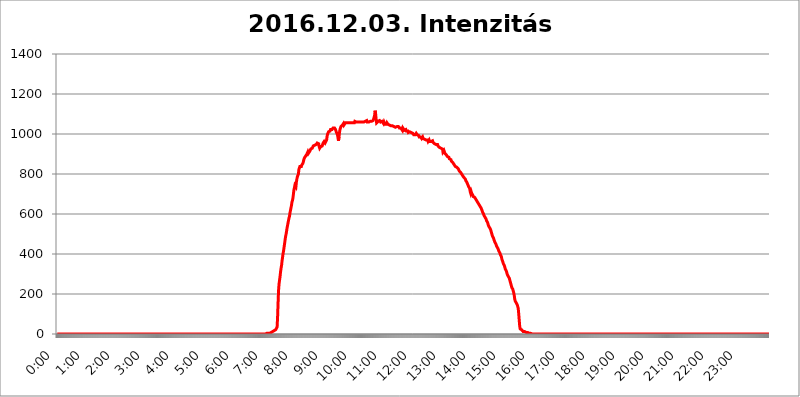
| Category | 2016.12.03. Intenzitás [W/m^2] |
|---|---|
| 0.0 | 0 |
| 0.0006944444444444445 | 0 |
| 0.001388888888888889 | 0 |
| 0.0020833333333333333 | 0 |
| 0.002777777777777778 | 0 |
| 0.003472222222222222 | 0 |
| 0.004166666666666667 | 0 |
| 0.004861111111111111 | 0 |
| 0.005555555555555556 | 0 |
| 0.0062499999999999995 | 0 |
| 0.006944444444444444 | 0 |
| 0.007638888888888889 | 0 |
| 0.008333333333333333 | 0 |
| 0.009027777777777779 | 0 |
| 0.009722222222222222 | 0 |
| 0.010416666666666666 | 0 |
| 0.011111111111111112 | 0 |
| 0.011805555555555555 | 0 |
| 0.012499999999999999 | 0 |
| 0.013194444444444444 | 0 |
| 0.013888888888888888 | 0 |
| 0.014583333333333332 | 0 |
| 0.015277777777777777 | 0 |
| 0.015972222222222224 | 0 |
| 0.016666666666666666 | 0 |
| 0.017361111111111112 | 0 |
| 0.018055555555555557 | 0 |
| 0.01875 | 0 |
| 0.019444444444444445 | 0 |
| 0.02013888888888889 | 0 |
| 0.020833333333333332 | 0 |
| 0.02152777777777778 | 0 |
| 0.022222222222222223 | 0 |
| 0.02291666666666667 | 0 |
| 0.02361111111111111 | 0 |
| 0.024305555555555556 | 0 |
| 0.024999999999999998 | 0 |
| 0.025694444444444447 | 0 |
| 0.02638888888888889 | 0 |
| 0.027083333333333334 | 0 |
| 0.027777777777777776 | 0 |
| 0.02847222222222222 | 0 |
| 0.029166666666666664 | 0 |
| 0.029861111111111113 | 0 |
| 0.030555555555555555 | 0 |
| 0.03125 | 0 |
| 0.03194444444444445 | 0 |
| 0.03263888888888889 | 0 |
| 0.03333333333333333 | 0 |
| 0.034027777777777775 | 0 |
| 0.034722222222222224 | 0 |
| 0.035416666666666666 | 0 |
| 0.036111111111111115 | 0 |
| 0.03680555555555556 | 0 |
| 0.0375 | 0 |
| 0.03819444444444444 | 0 |
| 0.03888888888888889 | 0 |
| 0.03958333333333333 | 0 |
| 0.04027777777777778 | 0 |
| 0.04097222222222222 | 0 |
| 0.041666666666666664 | 0 |
| 0.042361111111111106 | 0 |
| 0.04305555555555556 | 0 |
| 0.043750000000000004 | 0 |
| 0.044444444444444446 | 0 |
| 0.04513888888888889 | 0 |
| 0.04583333333333334 | 0 |
| 0.04652777777777778 | 0 |
| 0.04722222222222222 | 0 |
| 0.04791666666666666 | 0 |
| 0.04861111111111111 | 0 |
| 0.049305555555555554 | 0 |
| 0.049999999999999996 | 0 |
| 0.05069444444444445 | 0 |
| 0.051388888888888894 | 0 |
| 0.052083333333333336 | 0 |
| 0.05277777777777778 | 0 |
| 0.05347222222222222 | 0 |
| 0.05416666666666667 | 0 |
| 0.05486111111111111 | 0 |
| 0.05555555555555555 | 0 |
| 0.05625 | 0 |
| 0.05694444444444444 | 0 |
| 0.057638888888888885 | 0 |
| 0.05833333333333333 | 0 |
| 0.05902777777777778 | 0 |
| 0.059722222222222225 | 0 |
| 0.06041666666666667 | 0 |
| 0.061111111111111116 | 0 |
| 0.06180555555555556 | 0 |
| 0.0625 | 0 |
| 0.06319444444444444 | 0 |
| 0.06388888888888888 | 0 |
| 0.06458333333333334 | 0 |
| 0.06527777777777778 | 0 |
| 0.06597222222222222 | 0 |
| 0.06666666666666667 | 0 |
| 0.06736111111111111 | 0 |
| 0.06805555555555555 | 0 |
| 0.06874999999999999 | 0 |
| 0.06944444444444443 | 0 |
| 0.07013888888888889 | 0 |
| 0.07083333333333333 | 0 |
| 0.07152777777777779 | 0 |
| 0.07222222222222223 | 0 |
| 0.07291666666666667 | 0 |
| 0.07361111111111111 | 0 |
| 0.07430555555555556 | 0 |
| 0.075 | 0 |
| 0.07569444444444444 | 0 |
| 0.0763888888888889 | 0 |
| 0.07708333333333334 | 0 |
| 0.07777777777777778 | 0 |
| 0.07847222222222222 | 0 |
| 0.07916666666666666 | 0 |
| 0.0798611111111111 | 0 |
| 0.08055555555555556 | 0 |
| 0.08125 | 0 |
| 0.08194444444444444 | 0 |
| 0.08263888888888889 | 0 |
| 0.08333333333333333 | 0 |
| 0.08402777777777777 | 0 |
| 0.08472222222222221 | 0 |
| 0.08541666666666665 | 0 |
| 0.08611111111111112 | 0 |
| 0.08680555555555557 | 0 |
| 0.08750000000000001 | 0 |
| 0.08819444444444445 | 0 |
| 0.08888888888888889 | 0 |
| 0.08958333333333333 | 0 |
| 0.09027777777777778 | 0 |
| 0.09097222222222222 | 0 |
| 0.09166666666666667 | 0 |
| 0.09236111111111112 | 0 |
| 0.09305555555555556 | 0 |
| 0.09375 | 0 |
| 0.09444444444444444 | 0 |
| 0.09513888888888888 | 0 |
| 0.09583333333333333 | 0 |
| 0.09652777777777777 | 0 |
| 0.09722222222222222 | 0 |
| 0.09791666666666667 | 0 |
| 0.09861111111111111 | 0 |
| 0.09930555555555555 | 0 |
| 0.09999999999999999 | 0 |
| 0.10069444444444443 | 0 |
| 0.1013888888888889 | 0 |
| 0.10208333333333335 | 0 |
| 0.10277777777777779 | 0 |
| 0.10347222222222223 | 0 |
| 0.10416666666666667 | 0 |
| 0.10486111111111111 | 0 |
| 0.10555555555555556 | 0 |
| 0.10625 | 0 |
| 0.10694444444444444 | 0 |
| 0.1076388888888889 | 0 |
| 0.10833333333333334 | 0 |
| 0.10902777777777778 | 0 |
| 0.10972222222222222 | 0 |
| 0.1111111111111111 | 0 |
| 0.11180555555555556 | 0 |
| 0.11180555555555556 | 0 |
| 0.1125 | 0 |
| 0.11319444444444444 | 0 |
| 0.11388888888888889 | 0 |
| 0.11458333333333333 | 0 |
| 0.11527777777777777 | 0 |
| 0.11597222222222221 | 0 |
| 0.11666666666666665 | 0 |
| 0.1173611111111111 | 0 |
| 0.11805555555555557 | 0 |
| 0.11944444444444445 | 0 |
| 0.12013888888888889 | 0 |
| 0.12083333333333333 | 0 |
| 0.12152777777777778 | 0 |
| 0.12222222222222223 | 0 |
| 0.12291666666666667 | 0 |
| 0.12291666666666667 | 0 |
| 0.12361111111111112 | 0 |
| 0.12430555555555556 | 0 |
| 0.125 | 0 |
| 0.12569444444444444 | 0 |
| 0.12638888888888888 | 0 |
| 0.12708333333333333 | 0 |
| 0.16875 | 0 |
| 0.12847222222222224 | 0 |
| 0.12916666666666668 | 0 |
| 0.12986111111111112 | 0 |
| 0.13055555555555556 | 0 |
| 0.13125 | 0 |
| 0.13194444444444445 | 0 |
| 0.1326388888888889 | 0 |
| 0.13333333333333333 | 0 |
| 0.13402777777777777 | 0 |
| 0.13402777777777777 | 0 |
| 0.13472222222222222 | 0 |
| 0.13541666666666666 | 0 |
| 0.1361111111111111 | 0 |
| 0.13749999999999998 | 0 |
| 0.13819444444444443 | 0 |
| 0.1388888888888889 | 0 |
| 0.13958333333333334 | 0 |
| 0.14027777777777778 | 0 |
| 0.14097222222222222 | 0 |
| 0.14166666666666666 | 0 |
| 0.1423611111111111 | 0 |
| 0.14305555555555557 | 0 |
| 0.14375000000000002 | 0 |
| 0.14444444444444446 | 0 |
| 0.1451388888888889 | 0 |
| 0.1451388888888889 | 0 |
| 0.14652777777777778 | 0 |
| 0.14722222222222223 | 0 |
| 0.14791666666666667 | 0 |
| 0.1486111111111111 | 0 |
| 0.14930555555555555 | 0 |
| 0.15 | 0 |
| 0.15069444444444444 | 0 |
| 0.15138888888888888 | 0 |
| 0.15208333333333332 | 0 |
| 0.15277777777777776 | 0 |
| 0.15347222222222223 | 0 |
| 0.15416666666666667 | 0 |
| 0.15486111111111112 | 0 |
| 0.15555555555555556 | 0 |
| 0.15625 | 0 |
| 0.15694444444444444 | 0 |
| 0.15763888888888888 | 0 |
| 0.15833333333333333 | 0 |
| 0.15902777777777777 | 0 |
| 0.15972222222222224 | 0 |
| 0.16041666666666668 | 0 |
| 0.16111111111111112 | 0 |
| 0.16180555555555556 | 0 |
| 0.1625 | 0 |
| 0.16319444444444445 | 0 |
| 0.1638888888888889 | 0 |
| 0.16458333333333333 | 0 |
| 0.16527777777777777 | 0 |
| 0.16597222222222222 | 0 |
| 0.16666666666666666 | 0 |
| 0.1673611111111111 | 0 |
| 0.16805555555555554 | 0 |
| 0.16874999999999998 | 0 |
| 0.16944444444444443 | 0 |
| 0.17013888888888887 | 0 |
| 0.1708333333333333 | 0 |
| 0.17152777777777775 | 0 |
| 0.17222222222222225 | 0 |
| 0.1729166666666667 | 0 |
| 0.17361111111111113 | 0 |
| 0.17430555555555557 | 0 |
| 0.17500000000000002 | 0 |
| 0.17569444444444446 | 0 |
| 0.1763888888888889 | 0 |
| 0.17708333333333334 | 0 |
| 0.17777777777777778 | 0 |
| 0.17847222222222223 | 0 |
| 0.17916666666666667 | 0 |
| 0.1798611111111111 | 0 |
| 0.18055555555555555 | 0 |
| 0.18125 | 0 |
| 0.18194444444444444 | 0 |
| 0.1826388888888889 | 0 |
| 0.18333333333333335 | 0 |
| 0.1840277777777778 | 0 |
| 0.18472222222222223 | 0 |
| 0.18541666666666667 | 0 |
| 0.18611111111111112 | 0 |
| 0.18680555555555556 | 0 |
| 0.1875 | 0 |
| 0.18819444444444444 | 0 |
| 0.18888888888888888 | 0 |
| 0.18958333333333333 | 0 |
| 0.19027777777777777 | 0 |
| 0.1909722222222222 | 0 |
| 0.19166666666666665 | 0 |
| 0.19236111111111112 | 0 |
| 0.19305555555555554 | 0 |
| 0.19375 | 0 |
| 0.19444444444444445 | 0 |
| 0.1951388888888889 | 0 |
| 0.19583333333333333 | 0 |
| 0.19652777777777777 | 0 |
| 0.19722222222222222 | 0 |
| 0.19791666666666666 | 0 |
| 0.1986111111111111 | 0 |
| 0.19930555555555554 | 0 |
| 0.19999999999999998 | 0 |
| 0.20069444444444443 | 0 |
| 0.20138888888888887 | 0 |
| 0.2020833333333333 | 0 |
| 0.2027777777777778 | 0 |
| 0.2034722222222222 | 0 |
| 0.2041666666666667 | 0 |
| 0.20486111111111113 | 0 |
| 0.20555555555555557 | 0 |
| 0.20625000000000002 | 0 |
| 0.20694444444444446 | 0 |
| 0.2076388888888889 | 0 |
| 0.20833333333333334 | 0 |
| 0.20902777777777778 | 0 |
| 0.20972222222222223 | 0 |
| 0.21041666666666667 | 0 |
| 0.2111111111111111 | 0 |
| 0.21180555555555555 | 0 |
| 0.2125 | 0 |
| 0.21319444444444444 | 0 |
| 0.2138888888888889 | 0 |
| 0.21458333333333335 | 0 |
| 0.2152777777777778 | 0 |
| 0.21597222222222223 | 0 |
| 0.21666666666666667 | 0 |
| 0.21736111111111112 | 0 |
| 0.21805555555555556 | 0 |
| 0.21875 | 0 |
| 0.21944444444444444 | 0 |
| 0.22013888888888888 | 0 |
| 0.22083333333333333 | 0 |
| 0.22152777777777777 | 0 |
| 0.2222222222222222 | 0 |
| 0.22291666666666665 | 0 |
| 0.2236111111111111 | 0 |
| 0.22430555555555556 | 0 |
| 0.225 | 0 |
| 0.22569444444444445 | 0 |
| 0.2263888888888889 | 0 |
| 0.22708333333333333 | 0 |
| 0.22777777777777777 | 0 |
| 0.22847222222222222 | 0 |
| 0.22916666666666666 | 0 |
| 0.2298611111111111 | 0 |
| 0.23055555555555554 | 0 |
| 0.23124999999999998 | 0 |
| 0.23194444444444443 | 0 |
| 0.23263888888888887 | 0 |
| 0.2333333333333333 | 0 |
| 0.2340277777777778 | 0 |
| 0.2347222222222222 | 0 |
| 0.2354166666666667 | 0 |
| 0.23611111111111113 | 0 |
| 0.23680555555555557 | 0 |
| 0.23750000000000002 | 0 |
| 0.23819444444444446 | 0 |
| 0.2388888888888889 | 0 |
| 0.23958333333333334 | 0 |
| 0.24027777777777778 | 0 |
| 0.24097222222222223 | 0 |
| 0.24166666666666667 | 0 |
| 0.2423611111111111 | 0 |
| 0.24305555555555555 | 0 |
| 0.24375 | 0 |
| 0.24444444444444446 | 0 |
| 0.24513888888888888 | 0 |
| 0.24583333333333335 | 0 |
| 0.2465277777777778 | 0 |
| 0.24722222222222223 | 0 |
| 0.24791666666666667 | 0 |
| 0.24861111111111112 | 0 |
| 0.24930555555555556 | 0 |
| 0.25 | 0 |
| 0.25069444444444444 | 0 |
| 0.2513888888888889 | 0 |
| 0.2520833333333333 | 0 |
| 0.25277777777777777 | 0 |
| 0.2534722222222222 | 0 |
| 0.25416666666666665 | 0 |
| 0.2548611111111111 | 0 |
| 0.2555555555555556 | 0 |
| 0.25625000000000003 | 0 |
| 0.2569444444444445 | 0 |
| 0.2576388888888889 | 0 |
| 0.25833333333333336 | 0 |
| 0.2590277777777778 | 0 |
| 0.25972222222222224 | 0 |
| 0.2604166666666667 | 0 |
| 0.2611111111111111 | 0 |
| 0.26180555555555557 | 0 |
| 0.2625 | 0 |
| 0.26319444444444445 | 0 |
| 0.2638888888888889 | 0 |
| 0.26458333333333334 | 0 |
| 0.2652777777777778 | 0 |
| 0.2659722222222222 | 0 |
| 0.26666666666666666 | 0 |
| 0.2673611111111111 | 0 |
| 0.26805555555555555 | 0 |
| 0.26875 | 0 |
| 0.26944444444444443 | 0 |
| 0.2701388888888889 | 0 |
| 0.2708333333333333 | 0 |
| 0.27152777777777776 | 0 |
| 0.2722222222222222 | 0 |
| 0.27291666666666664 | 0 |
| 0.2736111111111111 | 0 |
| 0.2743055555555555 | 0 |
| 0.27499999999999997 | 0 |
| 0.27569444444444446 | 0 |
| 0.27638888888888885 | 0 |
| 0.27708333333333335 | 0 |
| 0.2777777777777778 | 0 |
| 0.27847222222222223 | 0 |
| 0.2791666666666667 | 0 |
| 0.2798611111111111 | 0 |
| 0.28055555555555556 | 0 |
| 0.28125 | 0 |
| 0.28194444444444444 | 0 |
| 0.2826388888888889 | 0 |
| 0.2833333333333333 | 0 |
| 0.28402777777777777 | 0 |
| 0.2847222222222222 | 0 |
| 0.28541666666666665 | 0 |
| 0.28611111111111115 | 0 |
| 0.28680555555555554 | 0 |
| 0.28750000000000003 | 0 |
| 0.2881944444444445 | 0 |
| 0.2888888888888889 | 0 |
| 0.28958333333333336 | 0 |
| 0.2902777777777778 | 0 |
| 0.29097222222222224 | 0 |
| 0.2916666666666667 | 0 |
| 0.2923611111111111 | 0 |
| 0.29305555555555557 | 3.525 |
| 0.29375 | 3.525 |
| 0.29444444444444445 | 3.525 |
| 0.2951388888888889 | 3.525 |
| 0.29583333333333334 | 3.525 |
| 0.2965277777777778 | 3.525 |
| 0.2972222222222222 | 3.525 |
| 0.29791666666666666 | 3.525 |
| 0.2986111111111111 | 7.887 |
| 0.29930555555555555 | 7.887 |
| 0.3 | 7.887 |
| 0.30069444444444443 | 12.257 |
| 0.3013888888888889 | 12.257 |
| 0.3020833333333333 | 12.257 |
| 0.30277777777777776 | 12.257 |
| 0.3034722222222222 | 16.636 |
| 0.30416666666666664 | 16.636 |
| 0.3048611111111111 | 16.636 |
| 0.3055555555555555 | 21.024 |
| 0.30624999999999997 | 21.024 |
| 0.3069444444444444 | 21.024 |
| 0.3076388888888889 | 21.024 |
| 0.30833333333333335 | 34.234 |
| 0.3090277777777778 | 83.205 |
| 0.30972222222222223 | 155.509 |
| 0.3104166666666667 | 219.309 |
| 0.3111111111111111 | 251.251 |
| 0.31180555555555556 | 269.49 |
| 0.3125 | 287.709 |
| 0.31319444444444444 | 310.44 |
| 0.3138888888888889 | 328.584 |
| 0.3145833333333333 | 342.162 |
| 0.31527777777777777 | 364.728 |
| 0.3159722222222222 | 382.715 |
| 0.31666666666666665 | 400.638 |
| 0.31736111111111115 | 414.035 |
| 0.31805555555555554 | 431.833 |
| 0.31875000000000003 | 449.551 |
| 0.3194444444444445 | 467.187 |
| 0.3201388888888889 | 484.735 |
| 0.32083333333333336 | 497.836 |
| 0.3215277777777778 | 510.885 |
| 0.32222222222222224 | 528.2 |
| 0.3229166666666667 | 541.121 |
| 0.3236111111111111 | 553.986 |
| 0.32430555555555557 | 566.793 |
| 0.325 | 579.542 |
| 0.32569444444444445 | 588.009 |
| 0.3263888888888889 | 604.864 |
| 0.32708333333333334 | 617.436 |
| 0.3277777777777778 | 629.948 |
| 0.3284722222222222 | 642.4 |
| 0.32916666666666666 | 658.909 |
| 0.3298611111111111 | 667.123 |
| 0.33055555555555555 | 679.395 |
| 0.33125 | 699.717 |
| 0.33194444444444443 | 719.877 |
| 0.3326388888888889 | 723.889 |
| 0.3333333333333333 | 743.859 |
| 0.3340277777777778 | 739.877 |
| 0.3347222222222222 | 735.89 |
| 0.3354166666666667 | 759.723 |
| 0.3361111111111111 | 775.492 |
| 0.3368055555555556 | 787.258 |
| 0.33749999999999997 | 787.258 |
| 0.33819444444444446 | 798.974 |
| 0.33888888888888885 | 822.26 |
| 0.33958333333333335 | 829.981 |
| 0.34027777777777773 | 837.682 |
| 0.34097222222222223 | 837.682 |
| 0.3416666666666666 | 833.834 |
| 0.3423611111111111 | 837.682 |
| 0.3430555555555555 | 845.365 |
| 0.34375 | 849.199 |
| 0.3444444444444445 | 853.029 |
| 0.3451388888888889 | 860.676 |
| 0.3458333333333334 | 872.114 |
| 0.34652777777777777 | 879.719 |
| 0.34722222222222227 | 879.719 |
| 0.34791666666666665 | 887.309 |
| 0.34861111111111115 | 887.309 |
| 0.34930555555555554 | 891.099 |
| 0.35000000000000003 | 898.668 |
| 0.3506944444444444 | 902.447 |
| 0.3513888888888889 | 909.996 |
| 0.3520833333333333 | 902.447 |
| 0.3527777777777778 | 906.223 |
| 0.3534722222222222 | 906.223 |
| 0.3541666666666667 | 913.766 |
| 0.3548611111111111 | 917.534 |
| 0.35555555555555557 | 925.06 |
| 0.35625 | 925.06 |
| 0.35694444444444445 | 925.06 |
| 0.3576388888888889 | 928.819 |
| 0.35833333333333334 | 932.576 |
| 0.3590277777777778 | 940.082 |
| 0.3597222222222222 | 940.082 |
| 0.36041666666666666 | 936.33 |
| 0.3611111111111111 | 943.832 |
| 0.36180555555555555 | 947.58 |
| 0.3625 | 947.58 |
| 0.36319444444444443 | 947.58 |
| 0.3638888888888889 | 951.327 |
| 0.3645833333333333 | 955.071 |
| 0.3652777777777778 | 958.814 |
| 0.3659722222222222 | 955.071 |
| 0.3666666666666667 | 951.327 |
| 0.3673611111111111 | 936.33 |
| 0.3680555555555556 | 928.819 |
| 0.36874999999999997 | 928.819 |
| 0.36944444444444446 | 936.33 |
| 0.37013888888888885 | 936.33 |
| 0.37083333333333335 | 932.576 |
| 0.37152777777777773 | 940.082 |
| 0.37222222222222223 | 947.58 |
| 0.3729166666666666 | 955.071 |
| 0.3736111111111111 | 955.071 |
| 0.3743055555555555 | 962.555 |
| 0.375 | 958.814 |
| 0.3756944444444445 | 955.071 |
| 0.3763888888888889 | 955.071 |
| 0.3770833333333334 | 958.814 |
| 0.37777777777777777 | 970.034 |
| 0.37847222222222227 | 988.714 |
| 0.37916666666666665 | 999.916 |
| 0.37986111111111115 | 1003.65 |
| 0.38055555555555554 | 1011.118 |
| 0.38125000000000003 | 1011.118 |
| 0.3819444444444444 | 1011.118 |
| 0.3826388888888889 | 1014.852 |
| 0.3833333333333333 | 1022.323 |
| 0.3840277777777778 | 1018.587 |
| 0.3847222222222222 | 1018.587 |
| 0.3854166666666667 | 1022.323 |
| 0.3861111111111111 | 1026.06 |
| 0.38680555555555557 | 1029.798 |
| 0.3875 | 1026.06 |
| 0.38819444444444445 | 1029.798 |
| 0.3888888888888889 | 1029.798 |
| 0.38958333333333334 | 1033.537 |
| 0.3902777777777778 | 1022.323 |
| 0.3909722222222222 | 1014.852 |
| 0.39166666666666666 | 1007.383 |
| 0.3923611111111111 | 1007.383 |
| 0.39305555555555555 | 996.182 |
| 0.39375 | 981.244 |
| 0.39444444444444443 | 966.295 |
| 0.3951388888888889 | 984.98 |
| 0.3958333333333333 | 1007.383 |
| 0.3965277777777778 | 1022.323 |
| 0.3972222222222222 | 1029.798 |
| 0.3979166666666667 | 1037.277 |
| 0.3986111111111111 | 1037.277 |
| 0.3993055555555556 | 1037.277 |
| 0.39999999999999997 | 1044.762 |
| 0.40069444444444446 | 1048.508 |
| 0.40138888888888885 | 1052.255 |
| 0.40208333333333335 | 1044.762 |
| 0.40277777777777773 | 1041.019 |
| 0.40347222222222223 | 1044.762 |
| 0.4041666666666666 | 1056.004 |
| 0.4048611111111111 | 1052.255 |
| 0.4055555555555555 | 1052.255 |
| 0.40625 | 1056.004 |
| 0.4069444444444445 | 1056.004 |
| 0.4076388888888889 | 1056.004 |
| 0.4083333333333334 | 1056.004 |
| 0.40902777777777777 | 1056.004 |
| 0.40972222222222227 | 1059.756 |
| 0.41041666666666665 | 1056.004 |
| 0.41111111111111115 | 1056.004 |
| 0.41180555555555554 | 1059.756 |
| 0.41250000000000003 | 1056.004 |
| 0.4131944444444444 | 1056.004 |
| 0.4138888888888889 | 1056.004 |
| 0.4145833333333333 | 1056.004 |
| 0.4152777777777778 | 1059.756 |
| 0.4159722222222222 | 1056.004 |
| 0.4166666666666667 | 1056.004 |
| 0.4173611111111111 | 1063.51 |
| 0.41805555555555557 | 1063.51 |
| 0.41875 | 1059.756 |
| 0.41944444444444445 | 1059.756 |
| 0.4201388888888889 | 1059.756 |
| 0.42083333333333334 | 1059.756 |
| 0.4215277777777778 | 1059.756 |
| 0.4222222222222222 | 1059.756 |
| 0.42291666666666666 | 1059.756 |
| 0.4236111111111111 | 1059.756 |
| 0.42430555555555555 | 1056.004 |
| 0.425 | 1059.756 |
| 0.42569444444444443 | 1059.756 |
| 0.4263888888888889 | 1056.004 |
| 0.4270833333333333 | 1059.756 |
| 0.4277777777777778 | 1059.756 |
| 0.4284722222222222 | 1056.004 |
| 0.4291666666666667 | 1059.756 |
| 0.4298611111111111 | 1059.756 |
| 0.4305555555555556 | 1056.004 |
| 0.43124999999999997 | 1059.756 |
| 0.43194444444444446 | 1063.51 |
| 0.43263888888888885 | 1059.756 |
| 0.43333333333333335 | 1067.267 |
| 0.43402777777777773 | 1067.267 |
| 0.43472222222222223 | 1059.756 |
| 0.4354166666666666 | 1063.51 |
| 0.4361111111111111 | 1063.51 |
| 0.4368055555555555 | 1059.756 |
| 0.4375 | 1059.756 |
| 0.4381944444444445 | 1059.756 |
| 0.4388888888888889 | 1063.51 |
| 0.4395833333333334 | 1059.756 |
| 0.44027777777777777 | 1067.267 |
| 0.44097222222222227 | 1063.51 |
| 0.44166666666666665 | 1063.51 |
| 0.44236111111111115 | 1067.267 |
| 0.44305555555555554 | 1067.267 |
| 0.44375000000000003 | 1074.789 |
| 0.4444444444444444 | 1078.555 |
| 0.4451388888888889 | 1093.653 |
| 0.4458333333333333 | 1116.426 |
| 0.4465277777777778 | 1101.226 |
| 0.4472222222222222 | 1074.789 |
| 0.4479166666666667 | 1056.004 |
| 0.4486111111111111 | 1059.756 |
| 0.44930555555555557 | 1056.004 |
| 0.45 | 1063.51 |
| 0.45069444444444445 | 1063.51 |
| 0.4513888888888889 | 1059.756 |
| 0.45208333333333334 | 1067.267 |
| 0.4527777777777778 | 1063.51 |
| 0.4534722222222222 | 1059.756 |
| 0.45416666666666666 | 1059.756 |
| 0.4548611111111111 | 1063.51 |
| 0.45555555555555555 | 1063.51 |
| 0.45625 | 1063.51 |
| 0.45694444444444443 | 1059.756 |
| 0.4576388888888889 | 1052.255 |
| 0.4583333333333333 | 1059.756 |
| 0.4590277777777778 | 1056.004 |
| 0.4597222222222222 | 1048.508 |
| 0.4604166666666667 | 1048.508 |
| 0.4611111111111111 | 1044.762 |
| 0.4618055555555556 | 1048.508 |
| 0.46249999999999997 | 1056.004 |
| 0.46319444444444446 | 1052.255 |
| 0.46388888888888885 | 1048.508 |
| 0.46458333333333335 | 1044.762 |
| 0.46527777777777773 | 1044.762 |
| 0.46597222222222223 | 1044.762 |
| 0.4666666666666666 | 1044.762 |
| 0.4673611111111111 | 1041.019 |
| 0.4680555555555555 | 1041.019 |
| 0.46875 | 1037.277 |
| 0.4694444444444445 | 1037.277 |
| 0.4701388888888889 | 1041.019 |
| 0.4708333333333334 | 1044.762 |
| 0.47152777777777777 | 1041.019 |
| 0.47222222222222227 | 1037.277 |
| 0.47291666666666665 | 1037.277 |
| 0.47361111111111115 | 1041.019 |
| 0.47430555555555554 | 1033.537 |
| 0.47500000000000003 | 1033.537 |
| 0.4756944444444444 | 1037.277 |
| 0.4763888888888889 | 1037.277 |
| 0.4770833333333333 | 1041.019 |
| 0.4777777777777778 | 1041.019 |
| 0.4784722222222222 | 1037.277 |
| 0.4791666666666667 | 1037.277 |
| 0.4798611111111111 | 1029.798 |
| 0.48055555555555557 | 1033.537 |
| 0.48125 | 1033.537 |
| 0.48194444444444445 | 1029.798 |
| 0.4826388888888889 | 1026.06 |
| 0.48333333333333334 | 1033.537 |
| 0.4840277777777778 | 1018.587 |
| 0.4847222222222222 | 1029.798 |
| 0.48541666666666666 | 1029.798 |
| 0.4861111111111111 | 1026.06 |
| 0.48680555555555555 | 1018.587 |
| 0.4875 | 1018.587 |
| 0.48819444444444443 | 1014.852 |
| 0.4888888888888889 | 1022.323 |
| 0.4895833333333333 | 1014.852 |
| 0.4902777777777778 | 1011.118 |
| 0.4909722222222222 | 1018.587 |
| 0.4916666666666667 | 1014.852 |
| 0.4923611111111111 | 1007.383 |
| 0.4930555555555556 | 1003.65 |
| 0.49374999999999997 | 1003.65 |
| 0.49444444444444446 | 1011.118 |
| 0.49513888888888885 | 1011.118 |
| 0.49583333333333335 | 1007.383 |
| 0.49652777777777773 | 1007.383 |
| 0.49722222222222223 | 1007.383 |
| 0.4979166666666666 | 1007.383 |
| 0.4986111111111111 | 1003.65 |
| 0.4993055555555555 | 999.916 |
| 0.5 | 996.182 |
| 0.5006944444444444 | 999.916 |
| 0.5013888888888889 | 999.916 |
| 0.5020833333333333 | 996.182 |
| 0.5027777777777778 | 999.916 |
| 0.5034722222222222 | 1003.65 |
| 0.5041666666666667 | 999.916 |
| 0.5048611111111111 | 996.182 |
| 0.5055555555555555 | 996.182 |
| 0.50625 | 992.448 |
| 0.5069444444444444 | 992.448 |
| 0.5076388888888889 | 984.98 |
| 0.5083333333333333 | 988.714 |
| 0.5090277777777777 | 984.98 |
| 0.5097222222222222 | 984.98 |
| 0.5104166666666666 | 984.98 |
| 0.5111111111111112 | 977.508 |
| 0.5118055555555555 | 981.244 |
| 0.5125000000000001 | 984.98 |
| 0.5131944444444444 | 977.508 |
| 0.513888888888889 | 977.508 |
| 0.5145833333333333 | 977.508 |
| 0.5152777777777778 | 973.772 |
| 0.5159722222222222 | 970.034 |
| 0.5166666666666667 | 973.772 |
| 0.517361111111111 | 970.034 |
| 0.5180555555555556 | 966.295 |
| 0.5187499999999999 | 970.034 |
| 0.5194444444444445 | 970.034 |
| 0.5201388888888888 | 962.555 |
| 0.5208333333333334 | 966.295 |
| 0.5215277777777778 | 970.034 |
| 0.5222222222222223 | 962.555 |
| 0.5229166666666667 | 962.555 |
| 0.5236111111111111 | 966.295 |
| 0.5243055555555556 | 962.555 |
| 0.525 | 966.295 |
| 0.5256944444444445 | 962.555 |
| 0.5263888888888889 | 966.295 |
| 0.5270833333333333 | 958.814 |
| 0.5277777777777778 | 958.814 |
| 0.5284722222222222 | 955.071 |
| 0.5291666666666667 | 951.327 |
| 0.5298611111111111 | 947.58 |
| 0.5305555555555556 | 951.327 |
| 0.53125 | 947.58 |
| 0.5319444444444444 | 947.58 |
| 0.5326388888888889 | 947.58 |
| 0.5333333333333333 | 947.58 |
| 0.5340277777777778 | 940.082 |
| 0.5347222222222222 | 940.082 |
| 0.5354166666666667 | 940.082 |
| 0.5361111111111111 | 932.576 |
| 0.5368055555555555 | 928.819 |
| 0.5375 | 928.819 |
| 0.5381944444444444 | 928.819 |
| 0.5388888888888889 | 925.06 |
| 0.5395833333333333 | 925.06 |
| 0.5402777777777777 | 925.06 |
| 0.5409722222222222 | 909.996 |
| 0.5416666666666666 | 913.766 |
| 0.5423611111111112 | 917.534 |
| 0.5430555555555555 | 909.996 |
| 0.5437500000000001 | 902.447 |
| 0.5444444444444444 | 902.447 |
| 0.545138888888889 | 898.668 |
| 0.5458333333333333 | 894.885 |
| 0.5465277777777778 | 891.099 |
| 0.5472222222222222 | 887.309 |
| 0.5479166666666667 | 883.516 |
| 0.548611111111111 | 883.516 |
| 0.5493055555555556 | 883.516 |
| 0.5499999999999999 | 875.918 |
| 0.5506944444444445 | 875.918 |
| 0.5513888888888888 | 872.114 |
| 0.5520833333333334 | 872.114 |
| 0.5527777777777778 | 864.493 |
| 0.5534722222222223 | 868.305 |
| 0.5541666666666667 | 860.676 |
| 0.5548611111111111 | 856.855 |
| 0.5555555555555556 | 856.855 |
| 0.55625 | 849.199 |
| 0.5569444444444445 | 849.199 |
| 0.5576388888888889 | 849.199 |
| 0.5583333333333333 | 837.682 |
| 0.5590277777777778 | 841.526 |
| 0.5597222222222222 | 841.526 |
| 0.5604166666666667 | 833.834 |
| 0.5611111111111111 | 833.834 |
| 0.5618055555555556 | 829.981 |
| 0.5625 | 826.123 |
| 0.5631944444444444 | 826.123 |
| 0.5638888888888889 | 814.519 |
| 0.5645833333333333 | 818.392 |
| 0.5652777777777778 | 814.519 |
| 0.5659722222222222 | 806.757 |
| 0.5666666666666667 | 806.757 |
| 0.5673611111111111 | 802.868 |
| 0.5680555555555555 | 795.074 |
| 0.56875 | 798.974 |
| 0.5694444444444444 | 791.169 |
| 0.5701388888888889 | 783.342 |
| 0.5708333333333333 | 783.342 |
| 0.5715277777777777 | 779.42 |
| 0.5722222222222222 | 775.492 |
| 0.5729166666666666 | 767.62 |
| 0.5736111111111112 | 763.674 |
| 0.5743055555555555 | 759.723 |
| 0.5750000000000001 | 755.766 |
| 0.5756944444444444 | 747.834 |
| 0.576388888888889 | 743.859 |
| 0.5770833333333333 | 735.89 |
| 0.5777777777777778 | 731.896 |
| 0.5784722222222222 | 727.896 |
| 0.5791666666666667 | 711.832 |
| 0.579861111111111 | 703.762 |
| 0.5805555555555556 | 711.832 |
| 0.5812499999999999 | 703.762 |
| 0.5819444444444445 | 699.717 |
| 0.5826388888888888 | 695.666 |
| 0.5833333333333334 | 687.544 |
| 0.5840277777777778 | 687.544 |
| 0.5847222222222223 | 687.544 |
| 0.5854166666666667 | 683.473 |
| 0.5861111111111111 | 679.395 |
| 0.5868055555555556 | 675.311 |
| 0.5875 | 675.311 |
| 0.5881944444444445 | 667.123 |
| 0.5888888888888889 | 663.019 |
| 0.5895833333333333 | 663.019 |
| 0.5902777777777778 | 654.791 |
| 0.5909722222222222 | 650.667 |
| 0.5916666666666667 | 646.537 |
| 0.5923611111111111 | 642.4 |
| 0.5930555555555556 | 638.256 |
| 0.59375 | 634.105 |
| 0.5944444444444444 | 629.948 |
| 0.5951388888888889 | 625.784 |
| 0.5958333333333333 | 617.436 |
| 0.5965277777777778 | 609.062 |
| 0.5972222222222222 | 604.864 |
| 0.5979166666666667 | 600.661 |
| 0.5986111111111111 | 592.233 |
| 0.5993055555555555 | 592.233 |
| 0.6 | 583.779 |
| 0.6006944444444444 | 579.542 |
| 0.6013888888888889 | 575.299 |
| 0.6020833333333333 | 566.793 |
| 0.6027777777777777 | 562.53 |
| 0.6034722222222222 | 558.261 |
| 0.6041666666666666 | 549.704 |
| 0.6048611111111112 | 541.121 |
| 0.6055555555555555 | 536.82 |
| 0.6062500000000001 | 532.513 |
| 0.6069444444444444 | 528.2 |
| 0.607638888888889 | 523.88 |
| 0.6083333333333333 | 515.223 |
| 0.6090277777777778 | 506.542 |
| 0.6097222222222222 | 497.836 |
| 0.6104166666666667 | 489.108 |
| 0.611111111111111 | 484.735 |
| 0.6118055555555556 | 480.356 |
| 0.6124999999999999 | 471.582 |
| 0.6131944444444445 | 471.582 |
| 0.6138888888888888 | 458.38 |
| 0.6145833333333334 | 453.968 |
| 0.6152777777777778 | 449.551 |
| 0.6159722222222223 | 440.702 |
| 0.6166666666666667 | 440.702 |
| 0.6173611111111111 | 436.27 |
| 0.6180555555555556 | 427.39 |
| 0.61875 | 422.943 |
| 0.6194444444444445 | 414.035 |
| 0.6201388888888889 | 409.574 |
| 0.6208333333333333 | 405.108 |
| 0.6215277777777778 | 396.164 |
| 0.6222222222222222 | 391.685 |
| 0.6229166666666667 | 387.202 |
| 0.6236111111111111 | 373.729 |
| 0.6243055555555556 | 369.23 |
| 0.625 | 360.221 |
| 0.6256944444444444 | 351.198 |
| 0.6263888888888889 | 346.682 |
| 0.6270833333333333 | 342.162 |
| 0.6277777777777778 | 333.113 |
| 0.6284722222222222 | 324.052 |
| 0.6291666666666667 | 319.517 |
| 0.6298611111111111 | 314.98 |
| 0.6305555555555555 | 305.898 |
| 0.63125 | 296.808 |
| 0.6319444444444444 | 296.808 |
| 0.6326388888888889 | 287.709 |
| 0.6333333333333333 | 283.156 |
| 0.6340277777777777 | 278.603 |
| 0.6347222222222222 | 269.49 |
| 0.6354166666666666 | 260.373 |
| 0.6361111111111112 | 251.251 |
| 0.6368055555555555 | 242.127 |
| 0.6375000000000001 | 233 |
| 0.6381944444444444 | 228.436 |
| 0.638888888888889 | 223.873 |
| 0.6395833333333333 | 219.309 |
| 0.6402777777777778 | 205.62 |
| 0.6409722222222222 | 191.937 |
| 0.6416666666666667 | 173.709 |
| 0.642361111111111 | 164.605 |
| 0.6430555555555556 | 160.056 |
| 0.6437499999999999 | 155.509 |
| 0.6444444444444445 | 150.964 |
| 0.6451388888888888 | 146.423 |
| 0.6458333333333334 | 141.884 |
| 0.6465277777777778 | 128.284 |
| 0.6472222222222223 | 101.184 |
| 0.6479166666666667 | 69.775 |
| 0.6486111111111111 | 38.653 |
| 0.6493055555555556 | 25.419 |
| 0.65 | 21.024 |
| 0.6506944444444445 | 21.024 |
| 0.6513888888888889 | 21.024 |
| 0.6520833333333333 | 16.636 |
| 0.6527777777777778 | 16.636 |
| 0.6534722222222222 | 12.257 |
| 0.6541666666666667 | 12.257 |
| 0.6548611111111111 | 12.257 |
| 0.6555555555555556 | 12.257 |
| 0.65625 | 12.257 |
| 0.6569444444444444 | 7.887 |
| 0.6576388888888889 | 7.887 |
| 0.6583333333333333 | 7.887 |
| 0.6590277777777778 | 7.887 |
| 0.6597222222222222 | 7.887 |
| 0.6604166666666667 | 3.525 |
| 0.6611111111111111 | 3.525 |
| 0.6618055555555555 | 3.525 |
| 0.6625 | 3.525 |
| 0.6631944444444444 | 3.525 |
| 0.6638888888888889 | 3.525 |
| 0.6645833333333333 | 3.525 |
| 0.6652777777777777 | 3.525 |
| 0.6659722222222222 | 0 |
| 0.6666666666666666 | 0 |
| 0.6673611111111111 | 0 |
| 0.6680555555555556 | 0 |
| 0.6687500000000001 | 0 |
| 0.6694444444444444 | 0 |
| 0.6701388888888888 | 0 |
| 0.6708333333333334 | 0 |
| 0.6715277777777778 | 0 |
| 0.6722222222222222 | 0 |
| 0.6729166666666666 | 0 |
| 0.6736111111111112 | 0 |
| 0.6743055555555556 | 0 |
| 0.6749999999999999 | 0 |
| 0.6756944444444444 | 0 |
| 0.6763888888888889 | 0 |
| 0.6770833333333334 | 0 |
| 0.6777777777777777 | 0 |
| 0.6784722222222223 | 0 |
| 0.6791666666666667 | 0 |
| 0.6798611111111111 | 0 |
| 0.6805555555555555 | 0 |
| 0.68125 | 0 |
| 0.6819444444444445 | 0 |
| 0.6826388888888889 | 0 |
| 0.6833333333333332 | 0 |
| 0.6840277777777778 | 0 |
| 0.6847222222222222 | 0 |
| 0.6854166666666667 | 0 |
| 0.686111111111111 | 0 |
| 0.6868055555555556 | 0 |
| 0.6875 | 0 |
| 0.6881944444444444 | 0 |
| 0.688888888888889 | 0 |
| 0.6895833333333333 | 0 |
| 0.6902777777777778 | 0 |
| 0.6909722222222222 | 0 |
| 0.6916666666666668 | 0 |
| 0.6923611111111111 | 0 |
| 0.6930555555555555 | 0 |
| 0.69375 | 0 |
| 0.6944444444444445 | 0 |
| 0.6951388888888889 | 0 |
| 0.6958333333333333 | 0 |
| 0.6965277777777777 | 0 |
| 0.6972222222222223 | 0 |
| 0.6979166666666666 | 0 |
| 0.6986111111111111 | 0 |
| 0.6993055555555556 | 0 |
| 0.7000000000000001 | 0 |
| 0.7006944444444444 | 0 |
| 0.7013888888888888 | 0 |
| 0.7020833333333334 | 0 |
| 0.7027777777777778 | 0 |
| 0.7034722222222222 | 0 |
| 0.7041666666666666 | 0 |
| 0.7048611111111112 | 0 |
| 0.7055555555555556 | 0 |
| 0.7062499999999999 | 0 |
| 0.7069444444444444 | 0 |
| 0.7076388888888889 | 0 |
| 0.7083333333333334 | 0 |
| 0.7090277777777777 | 0 |
| 0.7097222222222223 | 0 |
| 0.7104166666666667 | 0 |
| 0.7111111111111111 | 0 |
| 0.7118055555555555 | 0 |
| 0.7125 | 0 |
| 0.7131944444444445 | 0 |
| 0.7138888888888889 | 0 |
| 0.7145833333333332 | 0 |
| 0.7152777777777778 | 0 |
| 0.7159722222222222 | 0 |
| 0.7166666666666667 | 0 |
| 0.717361111111111 | 0 |
| 0.7180555555555556 | 0 |
| 0.71875 | 0 |
| 0.7194444444444444 | 0 |
| 0.720138888888889 | 0 |
| 0.7208333333333333 | 0 |
| 0.7215277777777778 | 0 |
| 0.7222222222222222 | 0 |
| 0.7229166666666668 | 0 |
| 0.7236111111111111 | 0 |
| 0.7243055555555555 | 0 |
| 0.725 | 0 |
| 0.7256944444444445 | 0 |
| 0.7263888888888889 | 0 |
| 0.7270833333333333 | 0 |
| 0.7277777777777777 | 0 |
| 0.7284722222222223 | 0 |
| 0.7291666666666666 | 0 |
| 0.7298611111111111 | 0 |
| 0.7305555555555556 | 0 |
| 0.7312500000000001 | 0 |
| 0.7319444444444444 | 0 |
| 0.7326388888888888 | 0 |
| 0.7333333333333334 | 0 |
| 0.7340277777777778 | 0 |
| 0.7347222222222222 | 0 |
| 0.7354166666666666 | 0 |
| 0.7361111111111112 | 0 |
| 0.7368055555555556 | 0 |
| 0.7374999999999999 | 0 |
| 0.7381944444444444 | 0 |
| 0.7388888888888889 | 0 |
| 0.7395833333333334 | 0 |
| 0.7402777777777777 | 0 |
| 0.7409722222222223 | 0 |
| 0.7416666666666667 | 0 |
| 0.7423611111111111 | 0 |
| 0.7430555555555555 | 0 |
| 0.74375 | 0 |
| 0.7444444444444445 | 0 |
| 0.7451388888888889 | 0 |
| 0.7458333333333332 | 0 |
| 0.7465277777777778 | 0 |
| 0.7472222222222222 | 0 |
| 0.7479166666666667 | 0 |
| 0.748611111111111 | 0 |
| 0.7493055555555556 | 0 |
| 0.75 | 0 |
| 0.7506944444444444 | 0 |
| 0.751388888888889 | 0 |
| 0.7520833333333333 | 0 |
| 0.7527777777777778 | 0 |
| 0.7534722222222222 | 0 |
| 0.7541666666666668 | 0 |
| 0.7548611111111111 | 0 |
| 0.7555555555555555 | 0 |
| 0.75625 | 0 |
| 0.7569444444444445 | 0 |
| 0.7576388888888889 | 0 |
| 0.7583333333333333 | 0 |
| 0.7590277777777777 | 0 |
| 0.7597222222222223 | 0 |
| 0.7604166666666666 | 0 |
| 0.7611111111111111 | 0 |
| 0.7618055555555556 | 0 |
| 0.7625000000000001 | 0 |
| 0.7631944444444444 | 0 |
| 0.7638888888888888 | 0 |
| 0.7645833333333334 | 0 |
| 0.7652777777777778 | 0 |
| 0.7659722222222222 | 0 |
| 0.7666666666666666 | 0 |
| 0.7673611111111112 | 0 |
| 0.7680555555555556 | 0 |
| 0.7687499999999999 | 0 |
| 0.7694444444444444 | 0 |
| 0.7701388888888889 | 0 |
| 0.7708333333333334 | 0 |
| 0.7715277777777777 | 0 |
| 0.7722222222222223 | 0 |
| 0.7729166666666667 | 0 |
| 0.7736111111111111 | 0 |
| 0.7743055555555555 | 0 |
| 0.775 | 0 |
| 0.7756944444444445 | 0 |
| 0.7763888888888889 | 0 |
| 0.7770833333333332 | 0 |
| 0.7777777777777778 | 0 |
| 0.7784722222222222 | 0 |
| 0.7791666666666667 | 0 |
| 0.779861111111111 | 0 |
| 0.7805555555555556 | 0 |
| 0.78125 | 0 |
| 0.7819444444444444 | 0 |
| 0.782638888888889 | 0 |
| 0.7833333333333333 | 0 |
| 0.7840277777777778 | 0 |
| 0.7847222222222222 | 0 |
| 0.7854166666666668 | 0 |
| 0.7861111111111111 | 0 |
| 0.7868055555555555 | 0 |
| 0.7875 | 0 |
| 0.7881944444444445 | 0 |
| 0.7888888888888889 | 0 |
| 0.7895833333333333 | 0 |
| 0.7902777777777777 | 0 |
| 0.7909722222222223 | 0 |
| 0.7916666666666666 | 0 |
| 0.7923611111111111 | 0 |
| 0.7930555555555556 | 0 |
| 0.7937500000000001 | 0 |
| 0.7944444444444444 | 0 |
| 0.7951388888888888 | 0 |
| 0.7958333333333334 | 0 |
| 0.7965277777777778 | 0 |
| 0.7972222222222222 | 0 |
| 0.7979166666666666 | 0 |
| 0.7986111111111112 | 0 |
| 0.7993055555555556 | 0 |
| 0.7999999999999999 | 0 |
| 0.8006944444444444 | 0 |
| 0.8013888888888889 | 0 |
| 0.8020833333333334 | 0 |
| 0.8027777777777777 | 0 |
| 0.8034722222222223 | 0 |
| 0.8041666666666667 | 0 |
| 0.8048611111111111 | 0 |
| 0.8055555555555555 | 0 |
| 0.80625 | 0 |
| 0.8069444444444445 | 0 |
| 0.8076388888888889 | 0 |
| 0.8083333333333332 | 0 |
| 0.8090277777777778 | 0 |
| 0.8097222222222222 | 0 |
| 0.8104166666666667 | 0 |
| 0.811111111111111 | 0 |
| 0.8118055555555556 | 0 |
| 0.8125 | 0 |
| 0.8131944444444444 | 0 |
| 0.813888888888889 | 0 |
| 0.8145833333333333 | 0 |
| 0.8152777777777778 | 0 |
| 0.8159722222222222 | 0 |
| 0.8166666666666668 | 0 |
| 0.8173611111111111 | 0 |
| 0.8180555555555555 | 0 |
| 0.81875 | 0 |
| 0.8194444444444445 | 0 |
| 0.8201388888888889 | 0 |
| 0.8208333333333333 | 0 |
| 0.8215277777777777 | 0 |
| 0.8222222222222223 | 0 |
| 0.8229166666666666 | 0 |
| 0.8236111111111111 | 0 |
| 0.8243055555555556 | 0 |
| 0.8250000000000001 | 0 |
| 0.8256944444444444 | 0 |
| 0.8263888888888888 | 0 |
| 0.8270833333333334 | 0 |
| 0.8277777777777778 | 0 |
| 0.8284722222222222 | 0 |
| 0.8291666666666666 | 0 |
| 0.8298611111111112 | 0 |
| 0.8305555555555556 | 0 |
| 0.8312499999999999 | 0 |
| 0.8319444444444444 | 0 |
| 0.8326388888888889 | 0 |
| 0.8333333333333334 | 0 |
| 0.8340277777777777 | 0 |
| 0.8347222222222223 | 0 |
| 0.8354166666666667 | 0 |
| 0.8361111111111111 | 0 |
| 0.8368055555555555 | 0 |
| 0.8375 | 0 |
| 0.8381944444444445 | 0 |
| 0.8388888888888889 | 0 |
| 0.8395833333333332 | 0 |
| 0.8402777777777778 | 0 |
| 0.8409722222222222 | 0 |
| 0.8416666666666667 | 0 |
| 0.842361111111111 | 0 |
| 0.8430555555555556 | 0 |
| 0.84375 | 0 |
| 0.8444444444444444 | 0 |
| 0.845138888888889 | 0 |
| 0.8458333333333333 | 0 |
| 0.8465277777777778 | 0 |
| 0.8472222222222222 | 0 |
| 0.8479166666666668 | 0 |
| 0.8486111111111111 | 0 |
| 0.8493055555555555 | 0 |
| 0.85 | 0 |
| 0.8506944444444445 | 0 |
| 0.8513888888888889 | 0 |
| 0.8520833333333333 | 0 |
| 0.8527777777777777 | 0 |
| 0.8534722222222223 | 0 |
| 0.8541666666666666 | 0 |
| 0.8548611111111111 | 0 |
| 0.8555555555555556 | 0 |
| 0.8562500000000001 | 0 |
| 0.8569444444444444 | 0 |
| 0.8576388888888888 | 0 |
| 0.8583333333333334 | 0 |
| 0.8590277777777778 | 0 |
| 0.8597222222222222 | 0 |
| 0.8604166666666666 | 0 |
| 0.8611111111111112 | 0 |
| 0.8618055555555556 | 0 |
| 0.8624999999999999 | 0 |
| 0.8631944444444444 | 0 |
| 0.8638888888888889 | 0 |
| 0.8645833333333334 | 0 |
| 0.8652777777777777 | 0 |
| 0.8659722222222223 | 0 |
| 0.8666666666666667 | 0 |
| 0.8673611111111111 | 0 |
| 0.8680555555555555 | 0 |
| 0.86875 | 0 |
| 0.8694444444444445 | 0 |
| 0.8701388888888889 | 0 |
| 0.8708333333333332 | 0 |
| 0.8715277777777778 | 0 |
| 0.8722222222222222 | 0 |
| 0.8729166666666667 | 0 |
| 0.873611111111111 | 0 |
| 0.8743055555555556 | 0 |
| 0.875 | 0 |
| 0.8756944444444444 | 0 |
| 0.876388888888889 | 0 |
| 0.8770833333333333 | 0 |
| 0.8777777777777778 | 0 |
| 0.8784722222222222 | 0 |
| 0.8791666666666668 | 0 |
| 0.8798611111111111 | 0 |
| 0.8805555555555555 | 0 |
| 0.88125 | 0 |
| 0.8819444444444445 | 0 |
| 0.8826388888888889 | 0 |
| 0.8833333333333333 | 0 |
| 0.8840277777777777 | 0 |
| 0.8847222222222223 | 0 |
| 0.8854166666666666 | 0 |
| 0.8861111111111111 | 0 |
| 0.8868055555555556 | 0 |
| 0.8875000000000001 | 0 |
| 0.8881944444444444 | 0 |
| 0.8888888888888888 | 0 |
| 0.8895833333333334 | 0 |
| 0.8902777777777778 | 0 |
| 0.8909722222222222 | 0 |
| 0.8916666666666666 | 0 |
| 0.8923611111111112 | 0 |
| 0.8930555555555556 | 0 |
| 0.8937499999999999 | 0 |
| 0.8944444444444444 | 0 |
| 0.8951388888888889 | 0 |
| 0.8958333333333334 | 0 |
| 0.8965277777777777 | 0 |
| 0.8972222222222223 | 0 |
| 0.8979166666666667 | 0 |
| 0.8986111111111111 | 0 |
| 0.8993055555555555 | 0 |
| 0.9 | 0 |
| 0.9006944444444445 | 0 |
| 0.9013888888888889 | 0 |
| 0.9020833333333332 | 0 |
| 0.9027777777777778 | 0 |
| 0.9034722222222222 | 0 |
| 0.9041666666666667 | 0 |
| 0.904861111111111 | 0 |
| 0.9055555555555556 | 0 |
| 0.90625 | 0 |
| 0.9069444444444444 | 0 |
| 0.907638888888889 | 0 |
| 0.9083333333333333 | 0 |
| 0.9090277777777778 | 0 |
| 0.9097222222222222 | 0 |
| 0.9104166666666668 | 0 |
| 0.9111111111111111 | 0 |
| 0.9118055555555555 | 0 |
| 0.9125 | 0 |
| 0.9131944444444445 | 0 |
| 0.9138888888888889 | 0 |
| 0.9145833333333333 | 0 |
| 0.9152777777777777 | 0 |
| 0.9159722222222223 | 0 |
| 0.9166666666666666 | 0 |
| 0.9173611111111111 | 0 |
| 0.9180555555555556 | 0 |
| 0.9187500000000001 | 0 |
| 0.9194444444444444 | 0 |
| 0.9201388888888888 | 0 |
| 0.9208333333333334 | 0 |
| 0.9215277777777778 | 0 |
| 0.9222222222222222 | 0 |
| 0.9229166666666666 | 0 |
| 0.9236111111111112 | 0 |
| 0.9243055555555556 | 0 |
| 0.9249999999999999 | 0 |
| 0.9256944444444444 | 0 |
| 0.9263888888888889 | 0 |
| 0.9270833333333334 | 0 |
| 0.9277777777777777 | 0 |
| 0.9284722222222223 | 0 |
| 0.9291666666666667 | 0 |
| 0.9298611111111111 | 0 |
| 0.9305555555555555 | 0 |
| 0.93125 | 0 |
| 0.9319444444444445 | 0 |
| 0.9326388888888889 | 0 |
| 0.9333333333333332 | 0 |
| 0.9340277777777778 | 0 |
| 0.9347222222222222 | 0 |
| 0.9354166666666667 | 0 |
| 0.936111111111111 | 0 |
| 0.9368055555555556 | 0 |
| 0.9375 | 0 |
| 0.9381944444444444 | 0 |
| 0.938888888888889 | 0 |
| 0.9395833333333333 | 0 |
| 0.9402777777777778 | 0 |
| 0.9409722222222222 | 0 |
| 0.9416666666666668 | 0 |
| 0.9423611111111111 | 0 |
| 0.9430555555555555 | 0 |
| 0.94375 | 0 |
| 0.9444444444444445 | 0 |
| 0.9451388888888889 | 0 |
| 0.9458333333333333 | 0 |
| 0.9465277777777777 | 0 |
| 0.9472222222222223 | 0 |
| 0.9479166666666666 | 0 |
| 0.9486111111111111 | 0 |
| 0.9493055555555556 | 0 |
| 0.9500000000000001 | 0 |
| 0.9506944444444444 | 0 |
| 0.9513888888888888 | 0 |
| 0.9520833333333334 | 0 |
| 0.9527777777777778 | 0 |
| 0.9534722222222222 | 0 |
| 0.9541666666666666 | 0 |
| 0.9548611111111112 | 0 |
| 0.9555555555555556 | 0 |
| 0.9562499999999999 | 0 |
| 0.9569444444444444 | 0 |
| 0.9576388888888889 | 0 |
| 0.9583333333333334 | 0 |
| 0.9590277777777777 | 0 |
| 0.9597222222222223 | 0 |
| 0.9604166666666667 | 0 |
| 0.9611111111111111 | 0 |
| 0.9618055555555555 | 0 |
| 0.9625 | 0 |
| 0.9631944444444445 | 0 |
| 0.9638888888888889 | 0 |
| 0.9645833333333332 | 0 |
| 0.9652777777777778 | 0 |
| 0.9659722222222222 | 0 |
| 0.9666666666666667 | 0 |
| 0.967361111111111 | 0 |
| 0.9680555555555556 | 0 |
| 0.96875 | 0 |
| 0.9694444444444444 | 0 |
| 0.970138888888889 | 0 |
| 0.9708333333333333 | 0 |
| 0.9715277777777778 | 0 |
| 0.9722222222222222 | 0 |
| 0.9729166666666668 | 0 |
| 0.9736111111111111 | 0 |
| 0.9743055555555555 | 0 |
| 0.975 | 0 |
| 0.9756944444444445 | 0 |
| 0.9763888888888889 | 0 |
| 0.9770833333333333 | 0 |
| 0.9777777777777777 | 0 |
| 0.9784722222222223 | 0 |
| 0.9791666666666666 | 0 |
| 0.9798611111111111 | 0 |
| 0.9805555555555556 | 0 |
| 0.9812500000000001 | 0 |
| 0.9819444444444444 | 0 |
| 0.9826388888888888 | 0 |
| 0.9833333333333334 | 0 |
| 0.9840277777777778 | 0 |
| 0.9847222222222222 | 0 |
| 0.9854166666666666 | 0 |
| 0.9861111111111112 | 0 |
| 0.9868055555555556 | 0 |
| 0.9874999999999999 | 0 |
| 0.9881944444444444 | 0 |
| 0.9888888888888889 | 0 |
| 0.9895833333333334 | 0 |
| 0.9902777777777777 | 0 |
| 0.9909722222222223 | 0 |
| 0.9916666666666667 | 0 |
| 0.9923611111111111 | 0 |
| 0.9930555555555555 | 0 |
| 0.99375 | 0 |
| 0.9944444444444445 | 0 |
| 0.9951388888888889 | 0 |
| 0.9958333333333332 | 0 |
| 0.9965277777777778 | 0 |
| 0.9972222222222222 | 0 |
| 0.9979166666666667 | 0 |
| 0.998611111111111 | 0 |
| 0.9993055555555556 | 0 |